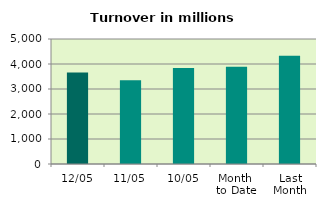
| Category | Series 0 |
|---|---|
| 12/05 | 3664.169 |
| 11/05 | 3349.012 |
| 10/05 | 3839.657 |
| Month 
to Date | 3892.157 |
| Last
Month | 4332.281 |